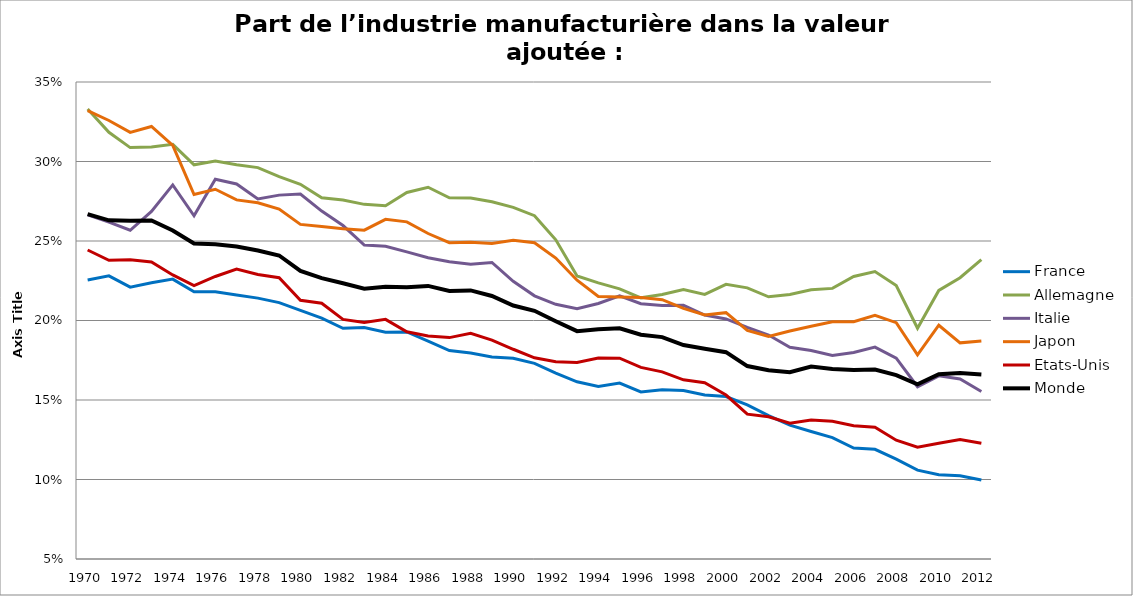
| Category | France | Allemagne | Italie | Japon | Etats-Unis | Monde |
|---|---|---|---|---|---|---|
| 1970.0 | 0.226 | 0.333 | 0.266 | 0.332 | 0.244 | 0.267 |
| 1971.0 | 0.228 | 0.318 | 0.262 | 0.326 | 0.238 | 0.263 |
| 1972.0 | 0.221 | 0.309 | 0.257 | 0.318 | 0.238 | 0.263 |
| 1973.0 | 0.224 | 0.309 | 0.269 | 0.322 | 0.237 | 0.263 |
| 1974.0 | 0.226 | 0.311 | 0.285 | 0.31 | 0.229 | 0.257 |
| 1975.0 | 0.218 | 0.298 | 0.266 | 0.279 | 0.222 | 0.248 |
| 1976.0 | 0.218 | 0.3 | 0.289 | 0.283 | 0.228 | 0.248 |
| 1977.0 | 0.216 | 0.298 | 0.286 | 0.276 | 0.232 | 0.247 |
| 1978.0 | 0.214 | 0.296 | 0.276 | 0.274 | 0.229 | 0.244 |
| 1979.0 | 0.211 | 0.29 | 0.279 | 0.27 | 0.227 | 0.241 |
| 1980.0 | 0.206 | 0.286 | 0.28 | 0.26 | 0.213 | 0.231 |
| 1981.0 | 0.202 | 0.277 | 0.269 | 0.259 | 0.211 | 0.227 |
| 1982.0 | 0.195 | 0.276 | 0.26 | 0.258 | 0.201 | 0.223 |
| 1983.0 | 0.196 | 0.273 | 0.247 | 0.257 | 0.199 | 0.22 |
| 1984.0 | 0.193 | 0.272 | 0.247 | 0.264 | 0.201 | 0.221 |
| 1985.0 | 0.193 | 0.281 | 0.243 | 0.262 | 0.193 | 0.221 |
| 1986.0 | 0.187 | 0.284 | 0.24 | 0.255 | 0.19 | 0.222 |
| 1987.0 | 0.181 | 0.277 | 0.237 | 0.249 | 0.189 | 0.219 |
| 1988.0 | 0.179 | 0.277 | 0.235 | 0.249 | 0.192 | 0.219 |
| 1989.0 | 0.177 | 0.275 | 0.236 | 0.248 | 0.188 | 0.215 |
| 1990.0 | 0.176 | 0.271 | 0.225 | 0.25 | 0.182 | 0.209 |
| 1991.0 | 0.173 | 0.266 | 0.216 | 0.249 | 0.177 | 0.206 |
| 1992.0 | 0.167 | 0.251 | 0.21 | 0.239 | 0.174 | 0.2 |
| 1993.0 | 0.161 | 0.228 | 0.207 | 0.225 | 0.174 | 0.193 |
| 1994.0 | 0.158 | 0.224 | 0.211 | 0.215 | 0.176 | 0.194 |
| 1995.0 | 0.161 | 0.22 | 0.215 | 0.215 | 0.176 | 0.195 |
| 1996.0 | 0.155 | 0.214 | 0.211 | 0.215 | 0.171 | 0.191 |
| 1997.0 | 0.156 | 0.216 | 0.209 | 0.213 | 0.168 | 0.19 |
| 1998.0 | 0.156 | 0.22 | 0.21 | 0.208 | 0.163 | 0.185 |
| 1999.0 | 0.153 | 0.216 | 0.203 | 0.203 | 0.161 | 0.182 |
| 2000.0 | 0.152 | 0.223 | 0.201 | 0.205 | 0.153 | 0.18 |
| 2001.0 | 0.147 | 0.221 | 0.196 | 0.194 | 0.141 | 0.171 |
| 2002.0 | 0.14 | 0.215 | 0.191 | 0.19 | 0.139 | 0.169 |
| 2003.0 | 0.134 | 0.216 | 0.183 | 0.193 | 0.135 | 0.167 |
| 2004.0 | 0.13 | 0.219 | 0.181 | 0.196 | 0.137 | 0.171 |
| 2005.0 | 0.126 | 0.22 | 0.178 | 0.199 | 0.137 | 0.17 |
| 2006.0 | 0.12 | 0.228 | 0.18 | 0.199 | 0.134 | 0.169 |
| 2007.0 | 0.119 | 0.231 | 0.183 | 0.203 | 0.133 | 0.169 |
| 2008.0 | 0.113 | 0.222 | 0.176 | 0.199 | 0.125 | 0.166 |
| 2009.0 | 0.106 | 0.195 | 0.158 | 0.178 | 0.12 | 0.16 |
| 2010.0 | 0.103 | 0.219 | 0.165 | 0.197 | 0.123 | 0.166 |
| 2011.0 | 0.102 | 0.227 | 0.163 | 0.186 | 0.125 | 0.167 |
| 2012.0 | 0.1 | 0.238 | 0.155 | 0.187 | 0.123 | 0.166 |